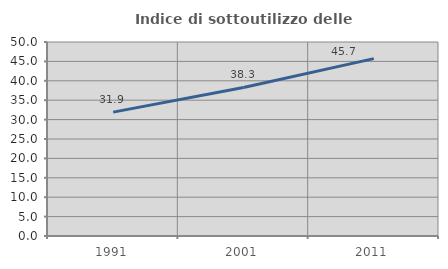
| Category | Indice di sottoutilizzo delle abitazioni  |
|---|---|
| 1991.0 | 31.927 |
| 2001.0 | 38.275 |
| 2011.0 | 45.719 |